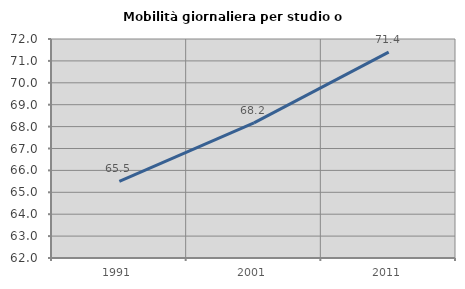
| Category | Mobilità giornaliera per studio o lavoro |
|---|---|
| 1991.0 | 65.499 |
| 2001.0 | 68.172 |
| 2011.0 | 71.401 |